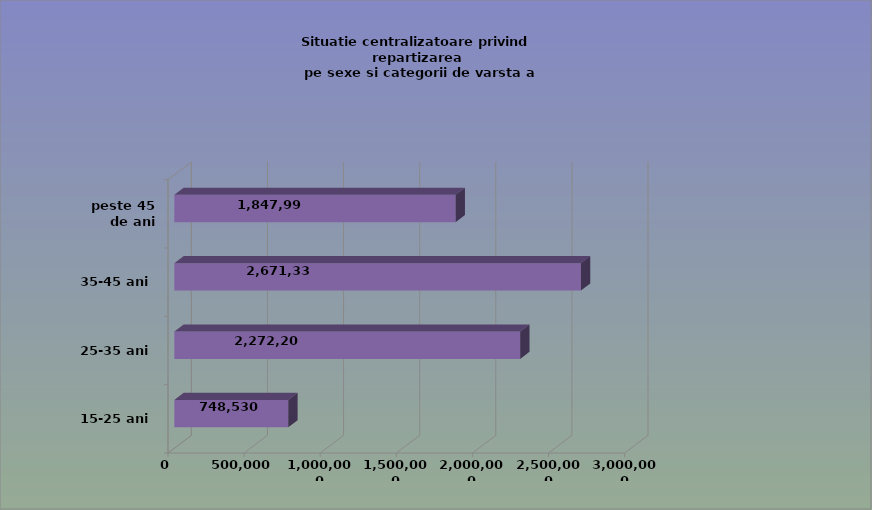
| Category | 15-25 ani 25-35 ani 35-45 ani peste 45 de ani |
|---|---|
| 15-25 ani | 748530 |
| 25-35 ani | 2272201 |
| 35-45 ani | 2671336 |
| peste 45 de ani | 1847997 |